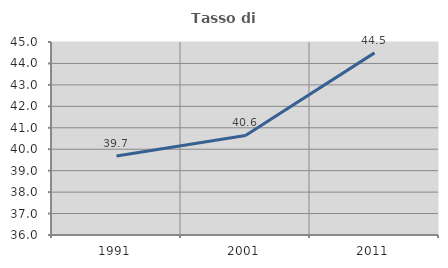
| Category | Tasso di occupazione   |
|---|---|
| 1991.0 | 39.684 |
| 2001.0 | 40.642 |
| 2011.0 | 44.493 |